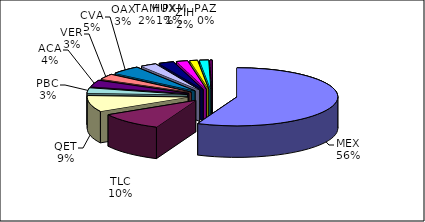
| Category | Series 0 |
|---|---|
| MEX | 361753 |
| TLC | 66823 |
| QET | 57905 |
| PBC | 18963 |
| ACA | 23193 |
| VER | 19522 |
| CVA | 30577 |
| OAX | 16626 |
| TAM | 15427 |
| ZIH | 11614 |
| HUX | 7840 |
| PXM | 9259 |
| PAZ | 2108 |